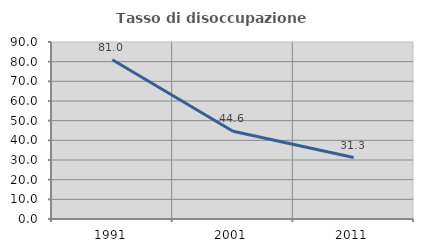
| Category | Tasso di disoccupazione giovanile  |
|---|---|
| 1991.0 | 80.97 |
| 2001.0 | 44.628 |
| 2011.0 | 31.25 |